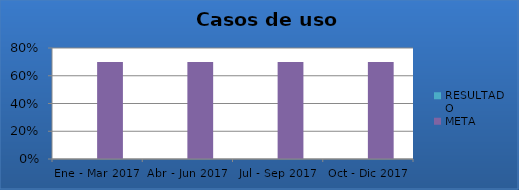
| Category | RESULTADO | META |
|---|---|---|
| Ene - Mar 2017 | 0 | 0.7 |
| Abr - Jun 2017 | 0 | 0.7 |
| Jul - Sep 2017 | 0 | 0.7 |
| Oct - Dic 2017 | 0 | 0.7 |